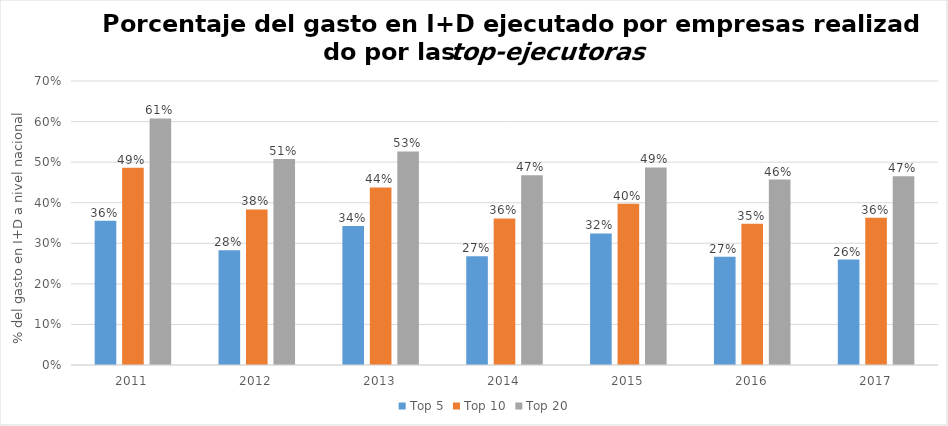
| Category | Top 5 | Top 10 | Top 20 |
|---|---|---|---|
| 2011.0 | 0.356 | 0.486 | 0.608 |
| 2012.0 | 0.283 | 0.383 | 0.508 |
| 2013.0 | 0.343 | 0.438 | 0.526 |
| 2014.0 | 0.268 | 0.361 | 0.467 |
| 2015.0 | 0.324 | 0.397 | 0.487 |
| 2016.0 | 0.267 | 0.348 | 0.457 |
| 2017.0 | 0.26 | 0.363 | 0.465 |